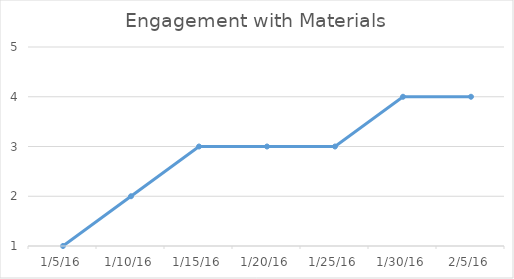
| Category | Series 0 |
|---|---|
| 1/5/16 | 1 |
| 1/10/16 | 2 |
| 1/15/16 | 3 |
| 1/20/16 | 3 |
| 1/25/16 | 3 |
| 1/30/16 | 4 |
| 2/5/16 | 4 |